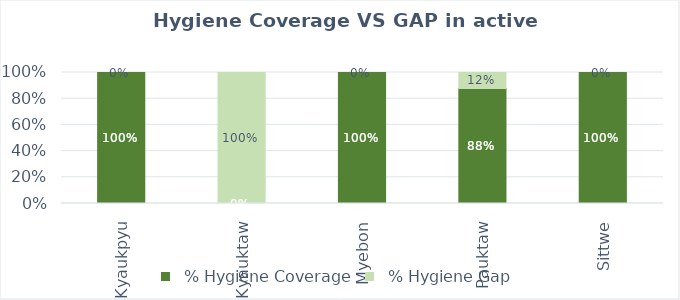
| Category |   % Hygiene Coverage |   % Hygiene Gap |
|---|---|---|
| Kyaukpyu | 1 | 0 |
| Kyauktaw | 0 | 1 |
| Myebon | 1 | 0 |
| Pauktaw | 0.878 | 0.122 |
| Sittwe | 1 | 0 |